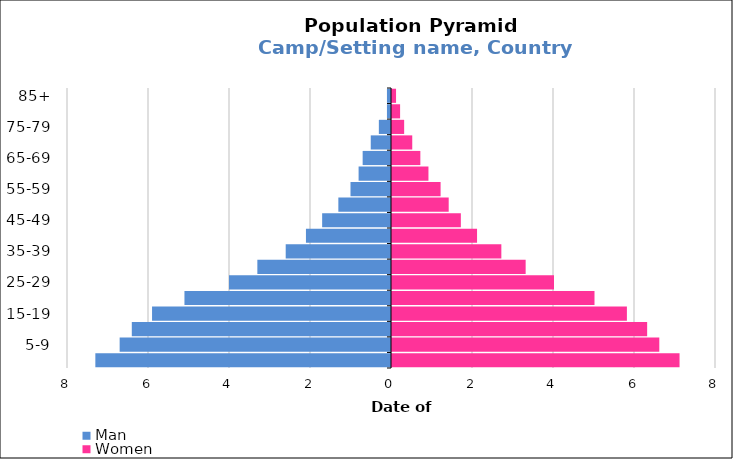
| Category | Man | Women |
|---|---|---|
| 85+ | -0.1 | 0.1 |
| 80-84 | -0.1 | 0.2 |
| 75-79 | -0.3 | 0.3 |
| 70-74 | -0.5 | 0.5 |
| 65-69 | -0.7 | 0.7 |
| 60-64 | -0.8 | 0.9 |
| 55-59 | -1 | 1.2 |
| 50-54 | -1.3 | 1.4 |
| 45-49 | -1.7 | 1.7 |
| 40-44 | -2.1 | 2.1 |
| 35-39 | -2.6 | 2.7 |
| 30-34 | -3.3 | 3.3 |
| 25-29 | -4 | 4 |
| 20-24 | -5.1 | 5 |
| 15-19 | -5.9 | 5.8 |
| 10-14 | -6.4 | 6.3 |
| 5-9 | -6.7 | 6.6 |
| 0-4 | -7.3 | 7.1 |